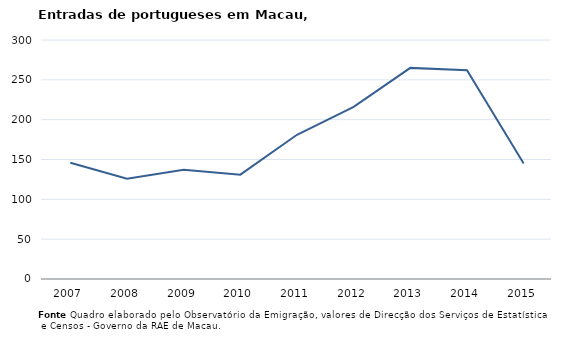
| Category | Entradas |
|---|---|
| 2007.0 | 146 |
| 2008.0 | 126 |
| 2009.0 | 137 |
| 2010.0 | 131 |
| 2011.0 | 181 |
| 2012.0 | 216 |
| 2013.0 | 265 |
| 2014.0 | 262 |
| 2015.0 | 145 |